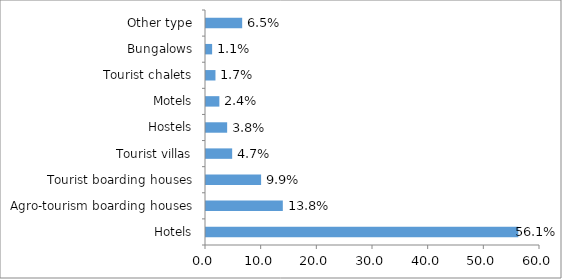
| Category | Tourist accommodation places |
|---|---|
| Hotels | 56.1 |
| Agro-tourism boarding houses | 13.8 |
| Tourist boarding houses | 9.9 |
| Tourist villas | 4.7 |
| Hostels | 3.8 |
| Motels | 2.4 |
| Tourist chalets | 1.7 |
| Bungalows | 1.1 |
| Other type | 6.5 |